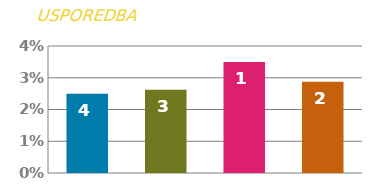
| Category | STOPA |
|---|---|
| 0 | 0.025 |
| 1 | 0.026 |
| 2 | 0.035 |
| 3 | 0.029 |